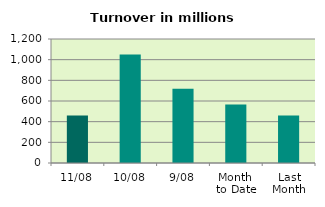
| Category | Series 0 |
|---|---|
| 11/08 | 460.545 |
| 10/08 | 1050.65 |
| 9/08 | 718.357 |
| Month 
to Date | 565.812 |
| Last
Month | 458.733 |